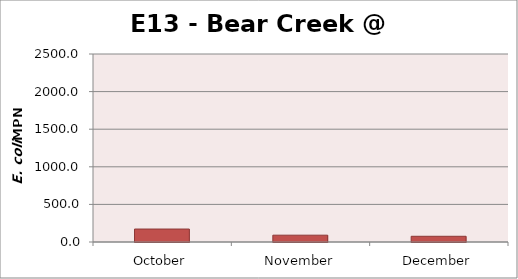
| Category | Series 0 |
|---|---|
| October | 172.3 |
| November | 90.6 |
| December | 75.9 |